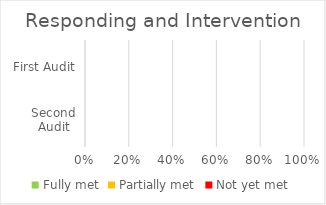
| Category | Fully met | Partially met | Not yet met |
|---|---|---|---|
| Second Audit | 0 | 0 | 0 |
| First Audit | 0 | 0 | 0 |